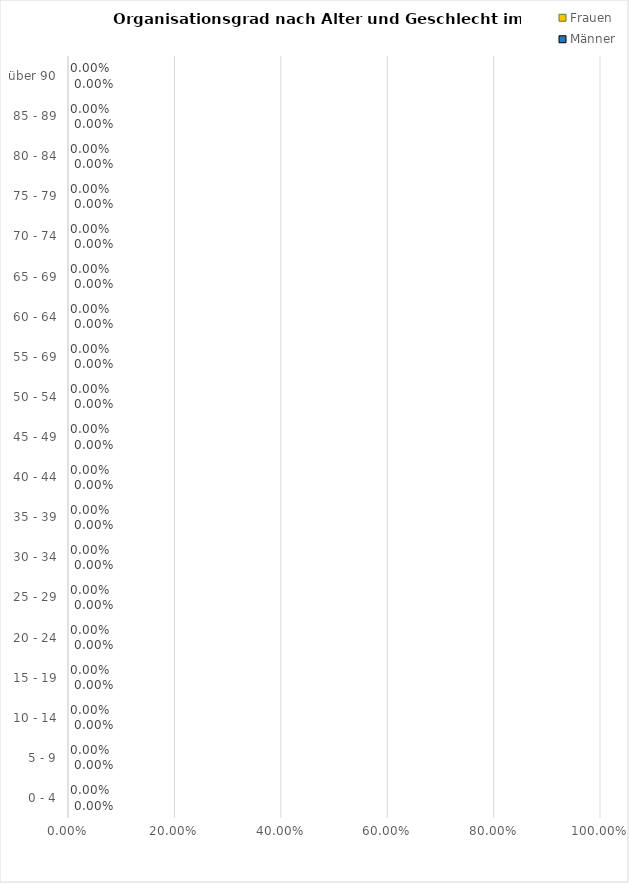
| Category | Männer | Frauen |
|---|---|---|
| 0 - 4 | 0 | 0 |
| 5 - 9 | 0 | 0 |
| 10 - 14 | 0 | 0 |
| 15 - 19 | 0 | 0 |
| 20 - 24 | 0 | 0 |
| 25 - 29 | 0 | 0 |
| 30 - 34 | 0 | 0 |
| 35 - 39 | 0 | 0 |
| 40 - 44 | 0 | 0 |
| 45 - 49 | 0 | 0 |
| 50 - 54 | 0 | 0 |
| 55 - 69 | 0 | 0 |
| 60 - 64 | 0 | 0 |
| 65 - 69 | 0 | 0 |
| 70 - 74 | 0 | 0 |
| 75 - 79 | 0 | 0 |
| 80 - 84 | 0 | 0 |
| 85 - 89 | 0 | 0 |
| über 90 | 0 | 0 |